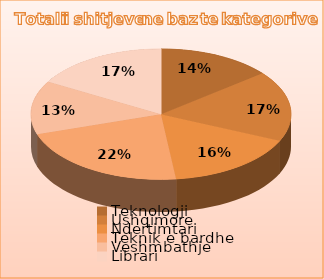
| Category | Series 0 |
|---|---|
| Teknologji | 3900 |
| Ushqimore | 4800 |
| Ndertimtari | 4523 |
| Teknik e bardhe | 6000 |
| Veshmbathje | 3653 |
| Librari | 4587 |